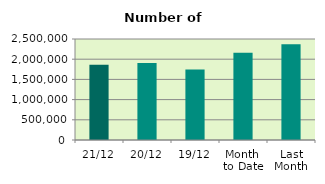
| Category | Series 0 |
|---|---|
| 21/12 | 1864384 |
| 20/12 | 1904856 |
| 19/12 | 1745796 |
| Month 
to Date | 2161886.133 |
| Last
Month | 2367033.455 |